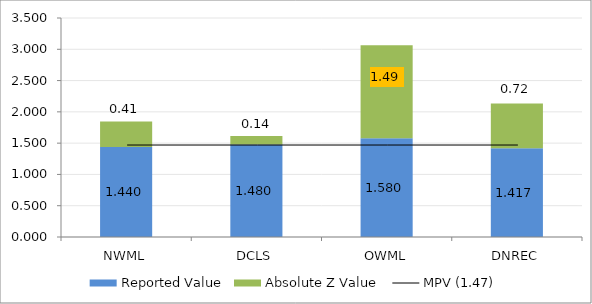
| Category | Reported Value | Absolute Z Value  |
|---|---|---|
| NWML | 1.44 | 0.405 |
| DCLS | 1.48 | 0.135 |
| OWML | 1.58 | 1.486 |
| DNREC | 1.417 | 0.716 |